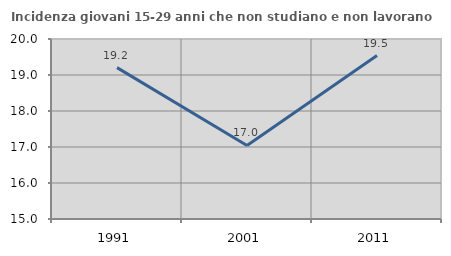
| Category | Incidenza giovani 15-29 anni che non studiano e non lavorano  |
|---|---|
| 1991.0 | 19.205 |
| 2001.0 | 17.044 |
| 2011.0 | 19.54 |